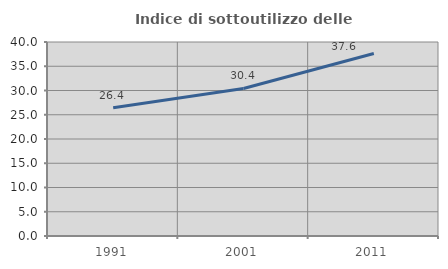
| Category | Indice di sottoutilizzo delle abitazioni  |
|---|---|
| 1991.0 | 26.423 |
| 2001.0 | 30.42 |
| 2011.0 | 37.621 |